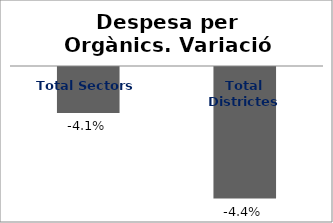
| Category | Series 0 |
|---|---|
| Total Sectors | -0.041 |
| Total Districtes | -0.044 |